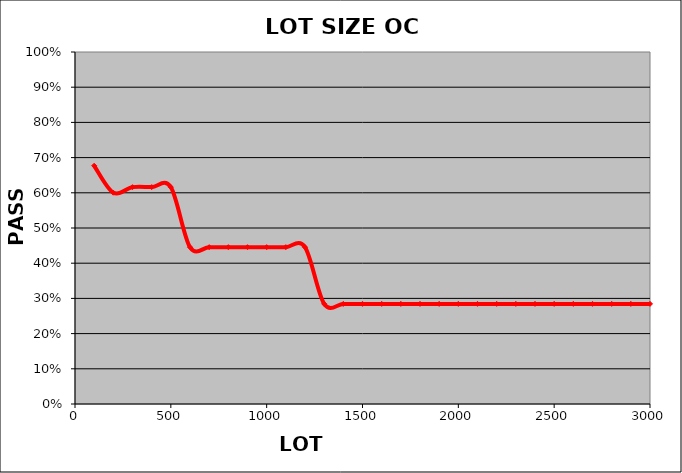
| Category | PASS
RATE |
|---|---|
| 100.0 | 0.677 |
| 200.0 | 0.6 |
| 300.0 | 0.616 |
| 400.0 | 0.616 |
| 500.0 | 0.616 |
| 600.0 | 0.446 |
| 700.0 | 0.446 |
| 800.0 | 0.446 |
| 900.0 | 0.446 |
| 1000.0 | 0.446 |
| 1100.0 | 0.446 |
| 1200.0 | 0.446 |
| 1300.0 | 0.284 |
| 1400.0 | 0.284 |
| 1500.0 | 0.284 |
| 1600.0 | 0.284 |
| 1700.0 | 0.284 |
| 1800.0 | 0.284 |
| 1900.0 | 0.284 |
| 2000.0 | 0.284 |
| 2100.0 | 0.284 |
| 2200.0 | 0.284 |
| 2300.0 | 0.284 |
| 2400.0 | 0.284 |
| 2500.0 | 0.284 |
| 2600.0 | 0.284 |
| 2700.0 | 0.284 |
| 2800.0 | 0.284 |
| 2900.0 | 0.284 |
| 3000.0 | 0.284 |